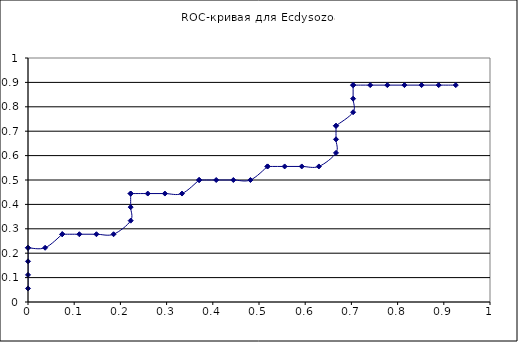
| Category | ROC-кривая для Ecdysozoa |
|---|---|
| 0.0 | 0.056 |
| 0.0 | 0.111 |
| 0.0 | 0.167 |
| 0.0 | 0.222 |
| 0.0 | 0.222 |
| 0.03703703703703709 | 0.222 |
| 0.07407407407407407 | 0.278 |
| 0.07407407407407407 | 0.278 |
| 0.11111111111111116 | 0.278 |
| 0.14814814814814814 | 0.278 |
| 0.18518518518518523 | 0.278 |
| 0.2222222222222222 | 0.333 |
| 0.2222222222222222 | 0.389 |
| 0.2222222222222222 | 0.444 |
| 0.2222222222222222 | 0.444 |
| 0.2592592592592593 | 0.444 |
| 0.2962962962962963 | 0.444 |
| 0.33333333333333337 | 0.444 |
| 0.37037037037037035 | 0.5 |
| 0.37037037037037035 | 0.5 |
| 0.40740740740740744 | 0.5 |
| 0.4444444444444444 | 0.5 |
| 0.4814814814814815 | 0.5 |
| 0.5185185185185186 | 0.556 |
| 0.5185185185185186 | 0.556 |
| 0.5555555555555556 | 0.556 |
| 0.5925925925925926 | 0.556 |
| 0.6296296296296297 | 0.556 |
| 0.6666666666666667 | 0.611 |
| 0.6666666666666667 | 0.667 |
| 0.6666666666666667 | 0.722 |
| 0.6666666666666667 | 0.722 |
| 0.7037037037037037 | 0.778 |
| 0.7037037037037037 | 0.833 |
| 0.7037037037037037 | 0.889 |
| 0.7037037037037037 | 0.889 |
| 0.7407407407407407 | 0.889 |
| 0.7777777777777778 | 0.889 |
| 0.8148148148148149 | 0.889 |
| 0.8518518518518519 | 0.889 |
| 0.8888888888888888 | 0.889 |
| 0.9259259259259259 | 0.889 |